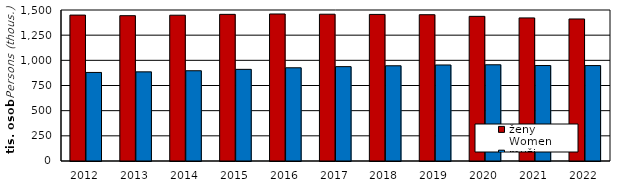
| Category | ženy  
Women | muži  
Men |
|---|---|---|
| 2012.0 | 1449444 | 879610 |
| 2013.0 | 1443656 | 885394 |
| 2014.0 | 1448159 | 896559 |
| 2015.0 | 1456816 | 910491 |
| 2016.0 | 1460422 | 926010 |
| 2017.0 | 1458157 | 937360 |
| 2018.0 | 1456115 | 946004 |
| 2019.0 | 1453153 | 953890 |
| 2020.0 | 1436866 | 955838 |
| 2021.0 | 1421344 | 948482 |
| 2022.0 | 1410848 | 948007 |